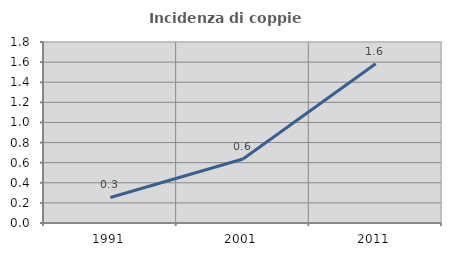
| Category | Incidenza di coppie miste |
|---|---|
| 1991.0 | 0.254 |
| 2001.0 | 0.636 |
| 2011.0 | 1.583 |